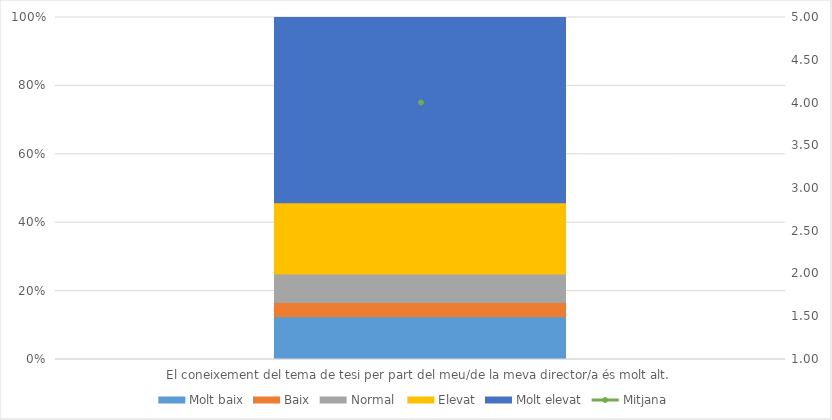
| Category | Molt baix | Baix | Normal  | Elevat | Molt elevat |
|---|---|---|---|---|---|
| El coneixement del tema de tesi per part del meu/de la meva director/a és molt alt. | 6 | 2 | 4 | 10 | 26 |